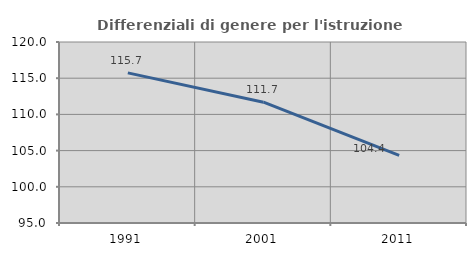
| Category | Differenziali di genere per l'istruzione superiore |
|---|---|
| 1991.0 | 115.739 |
| 2001.0 | 111.685 |
| 2011.0 | 104.354 |